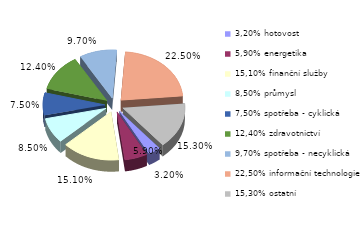
| Category | Series 0 |
|---|---|
| 3,20% hotovost | 0.032 |
| 5,90% energetika | 0.059 |
| 15,10% finanční služby | 0.151 |
| 8,50% průmysl | 0.085 |
| 7,50% spotřeba - cyklická | 0.075 |
| 12,40% zdravotnictví | 0.124 |
| 9,70% spotřeba - necyklická | 0.097 |
| 22,50% informační technologie | 0.225 |
| 15,30% ostatní | 0.153 |